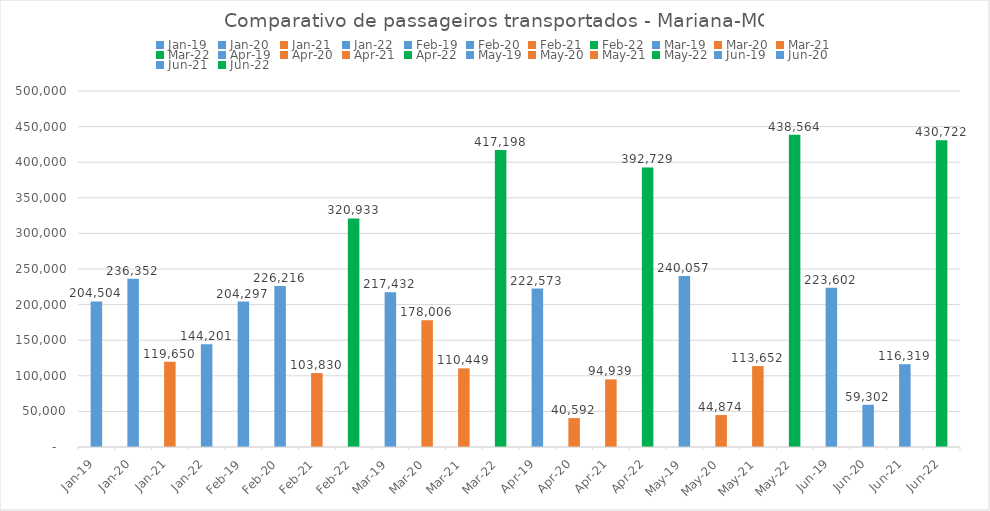
| Category | TOTAL |
|---|---|
| 2019-01-01 | 204503.57 |
| 2020-01-01 | 236351.65 |
| 2021-01-01 | 119649.89 |
| 2022-01-01 | 144201 |
| 2019-02-01 | 204297 |
| 2020-02-01 | 226216 |
| 2021-02-01 | 103830 |
| 2022-02-01 | 320933 |
| 2019-03-01 | 217432.16 |
| 2020-03-01 | 178006 |
| 2021-03-01 | 110449.36 |
| 2022-03-01 | 417198 |
| 2019-04-01 | 222573.45 |
| 2020-04-01 | 40591.97 |
| 2021-04-01 | 94939.4 |
| 2022-04-01 | 392729 |
| 2019-05-01 | 240056.74 |
| 2020-05-01 | 44873.94 |
| 2021-05-01 | 113652.02 |
| 2022-05-01 | 438564 |
| 2019-06-01 | 223601.95 |
| 2020-06-01 | 59302.15 |
| 2021-06-01 | 116319.09 |
| 2022-06-01 | 430722 |